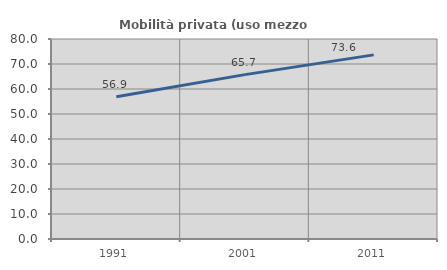
| Category | Mobilità privata (uso mezzo privato) |
|---|---|
| 1991.0 | 56.881 |
| 2001.0 | 65.743 |
| 2011.0 | 73.645 |